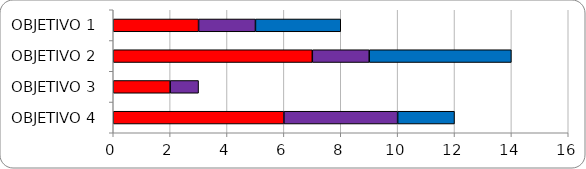
| Category | Series 0 | Series 1 | Series 2 |
|---|---|---|---|
| OBJETIVO 1 | 3 | 2 | 3 |
| OBJETIVO 2 | 7 | 2 | 5 |
| OBJETIVO 3 | 2 | 1 | 0 |
| OBJETIVO 4 | 6 | 4 | 2 |